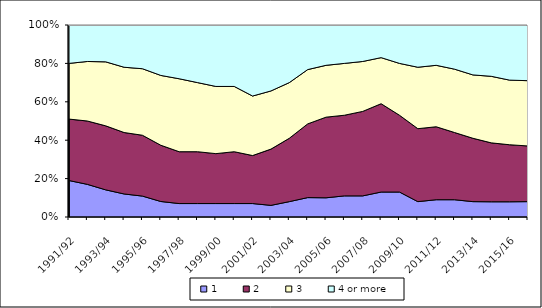
| Category | Number of bedrooms | 1 | 2 | 3 | 4 or more |
|---|---|---|---|---|---|
| 1991/92 |  | 19 | 32 | 29 | 20 |
| 1992/93 |  | 17 | 33 | 31 | 19 |
| 1993/94 |  | 14 | 33 | 33 | 19 |
| 1994/95 |  | 12 | 32 | 34 | 22 |
| 1995/96 |  | 11 | 32 | 35 | 23 |
| 1996/97 |  | 8 | 29 | 36 | 26 |
| 1997/98 |  | 7 | 27 | 38 | 28 |
| 1998/99 |  | 7 | 27 | 36 | 30 |
| 1999/00 |  | 7 | 26 | 35 | 32 |
| 2000/01 |  | 7 | 27 | 34 | 32 |
| 2001/02 |  | 7 | 25 | 31 | 37 |
| 2002/03 |  | 6 | 29 | 30 | 34 |
| 2003/04 |  | 8 | 33 | 29 | 30 |
| 2004/05 |  | 10 | 38 | 28 | 23 |
| 2005/06 |  | 10 | 42 | 27 | 21 |
| 2006/07 |  | 11 | 42 | 27 | 20 |
| 2007/08 |  | 11 | 44 | 26 | 19 |
| 2008/09 |  | 13 | 46 | 24 | 17 |
| 2009/10 |  | 13 | 40 | 27 | 20 |
| 2010/11 |  | 8 | 38 | 32 | 22 |
| 2011/12 |  | 9 | 38 | 32 | 21 |
| 2012/13 |  | 9 | 35 | 33 | 23 |
| 2013/14 |  | 8 | 33 | 33 | 26 |
| 2014/15 |  | 8 | 31 | 35 | 27 |
| 2015/16 |  | 8 | 30 | 34 | 29 |
| 2016/17 |  | 8 | 29 | 34 | 29 |